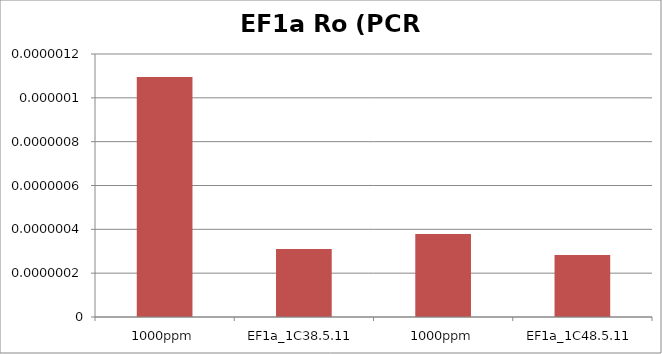
| Category | EF1a Ro |
|---|---|
| 0 | 0 |
| 1 | 0 |
| 2 | 0 |
| 3 | 0 |